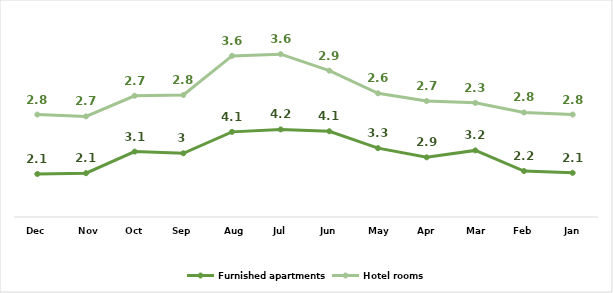
| Category | Furnished apartments | Hotel rooms |
|---|---|---|
| Jan | 2.113 | 2.791 |
| Feb | 2.2 | 2.804 |
| Mar | 3.188 | 2.276 |
| Apr | 2.856 | 2.695 |
| May | 3.296 | 2.626 |
| Jun | 4.105 | 2.9 |
| Jul | 4.192 | 3.603 |
| Aug | 4.076 | 3.637 |
| Sep | 3.049 | 2.793 |
| Oct | 3.132 | 2.673 |
| Nov | 2.098 | 2.718 |
| Dec | 2.058 | 2.846 |